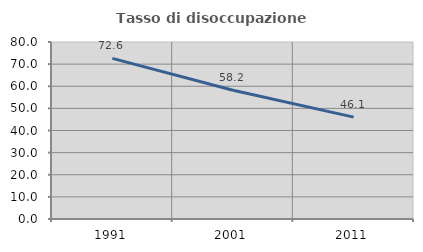
| Category | Tasso di disoccupazione giovanile  |
|---|---|
| 1991.0 | 72.607 |
| 2001.0 | 58.223 |
| 2011.0 | 46.053 |